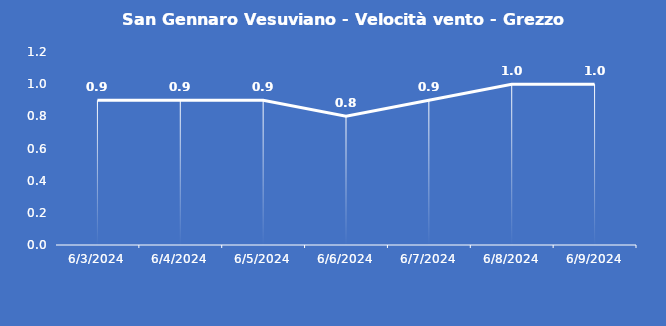
| Category | San Gennaro Vesuviano - Velocità vento - Grezzo (m/s) |
|---|---|
| 6/3/24 | 0.9 |
| 6/4/24 | 0.9 |
| 6/5/24 | 0.9 |
| 6/6/24 | 0.8 |
| 6/7/24 | 0.9 |
| 6/8/24 | 1 |
| 6/9/24 | 1 |